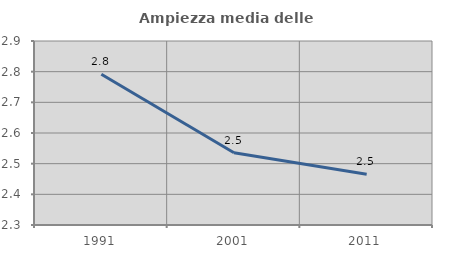
| Category | Ampiezza media delle famiglie |
|---|---|
| 1991.0 | 2.792 |
| 2001.0 | 2.535 |
| 2011.0 | 2.466 |